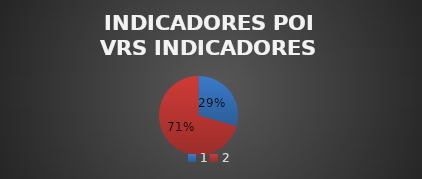
| Category | Series 0 |
|---|---|
| 0 | 10 |
| 1 | 24 |